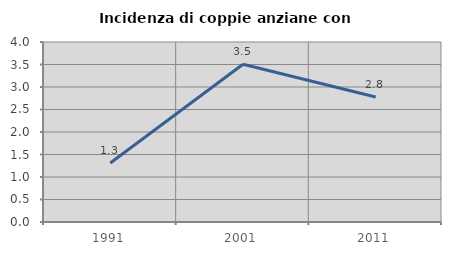
| Category | Incidenza di coppie anziane con figli |
|---|---|
| 1991.0 | 1.31 |
| 2001.0 | 3.504 |
| 2011.0 | 2.778 |